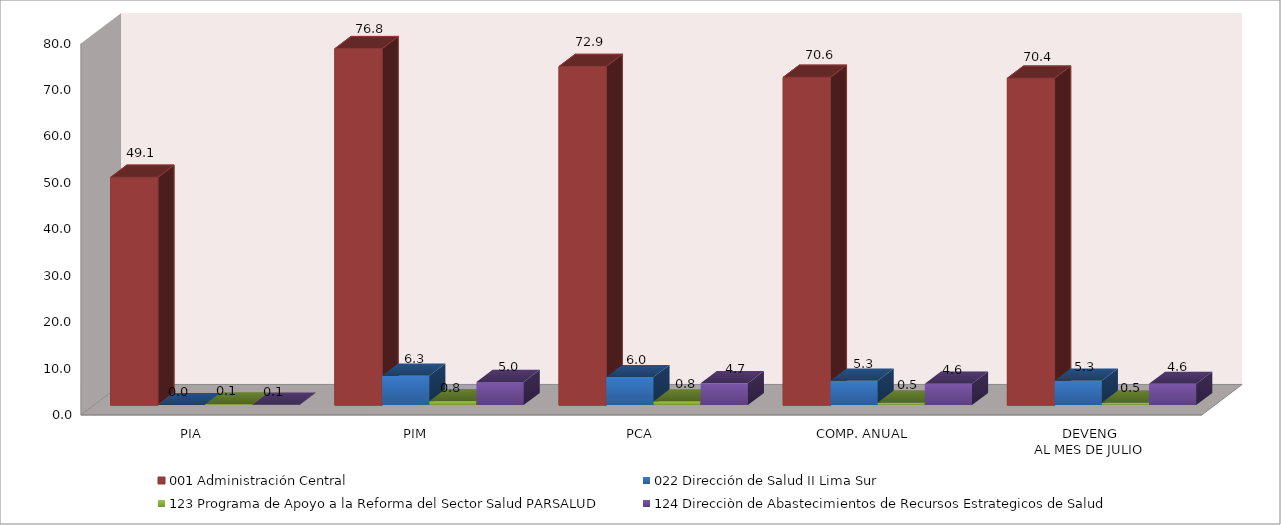
| Category | 001 Administración Central | 022 Dirección de Salud II Lima Sur | 123 Programa de Apoyo a la Reforma del Sector Salud PARSALUD | 124 Direcciòn de Abastecimientos de Recursos Estrategicos de Salud |
|---|---|---|---|---|
| PIA | 49.074 | 0 | 0.136 | 0.1 |
| PIM | 76.773 | 6.344 | 0.836 | 4.967 |
| PCA | 72.935 | 6.027 | 0.794 | 4.719 |
| COMP. ANUAL | 70.602 | 5.268 | 0.493 | 4.593 |
| DEVENG
AL MES DE JULIO | 70.412 | 5.257 | 0.493 | 4.578 |